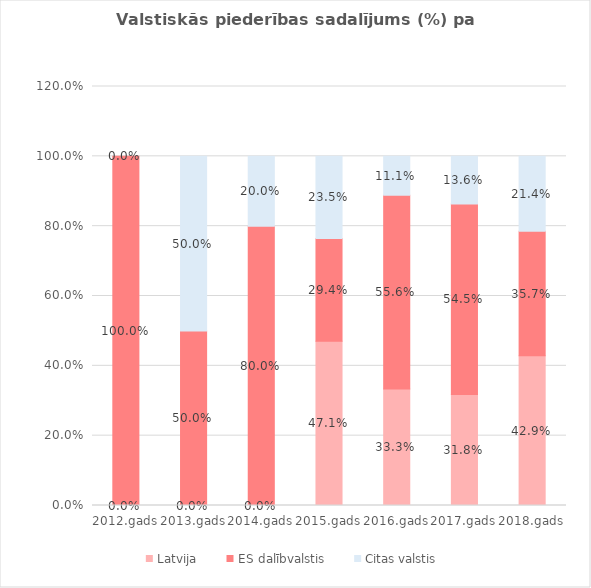
| Category | Latvija | ES dalībvalstis | Citas valstis |
|---|---|---|---|
| 2012.gads | 0 | 1 | 0 |
| 2013.gads | 0 | 0.5 | 0.5 |
| 2014.gads | 0 | 0.8 | 0.2 |
| 2015.gads | 0.471 | 0.294 | 0.235 |
| 2016.gads | 0.333 | 0.556 | 0.111 |
| 2017.gads | 0.318 | 0.545 | 0.136 |
| 2018.gads | 0.429 | 0.357 | 0.214 |